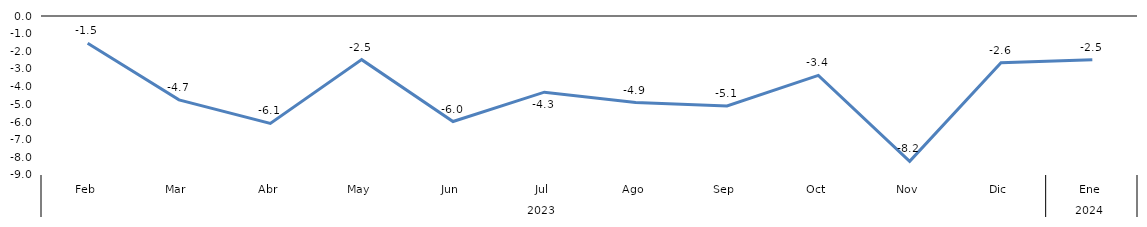
| Category | Bogotá |
|---|---|
| 0 | -1.54 |
| 1 | -4.748 |
| 2 | -6.083 |
| 3 | -2.47 |
| 4 | -5.973 |
| 5 | -4.311 |
| 6 | -4.898 |
| 7 | -5.089 |
| 8 | -3.361 |
| 9 | -8.227 |
| 10 | -2.649 |
| 11 | -2.475 |